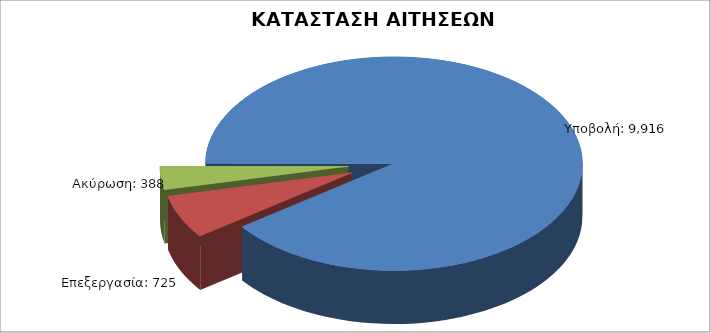
| Category | Series 0 |
|---|---|
| Υποβολή: | 9916 |
| Επεξεργασία: | 725 |
| Ακύρωση: | 388 |